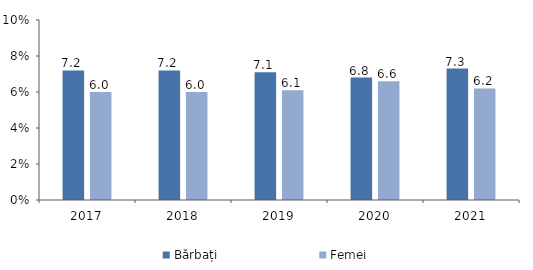
| Category | Bărbați | Femei |
|---|---|---|
| 2017.0 | 7.2 | 6 |
| 2018.0 | 7.2 | 6 |
| 2019.0 | 7.1 | 6.1 |
| 2020.0 | 6.8 | 6.6 |
| 2021.0 | 7.3 | 6.2 |